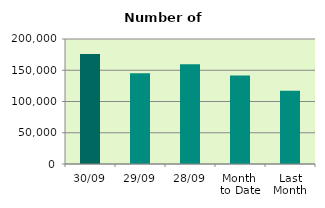
| Category | Series 0 |
|---|---|
| 30/09 | 176044 |
| 29/09 | 145360 |
| 28/09 | 159662 |
| Month 
to Date | 141428.727 |
| Last
Month | 117090.273 |